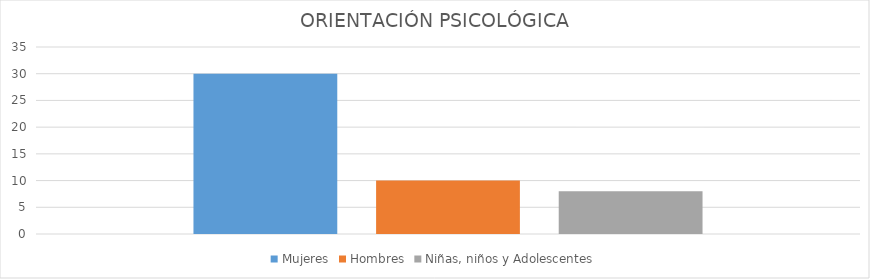
| Category | Mujeres | Hombres | Niñas, niños y Adolescentes |
|---|---|---|---|
| 0 | 30 | 10 | 8 |